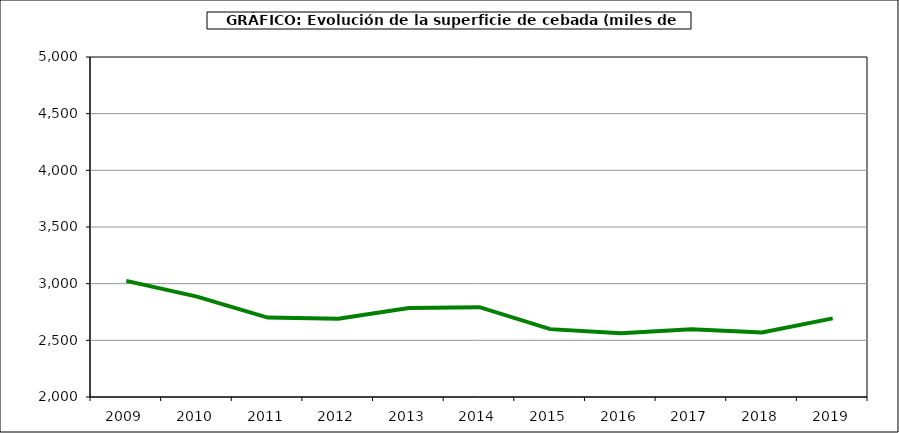
| Category | Superficie |
|---|---|
| 2009.0 | 3024.726 |
| 2010.0 | 2885.612 |
| 2011.0 | 2700.679 |
| 2012.0 | 2691.086 |
| 2013.0 | 2784.281 |
| 2014.0 | 2792.226 |
| 2015.0 | 2598.896 |
| 2016.0 | 2563.195 |
| 2017.0 | 2597.527 |
| 2018.0 | 2569.462 |
| 2019.0 | 2693.508 |